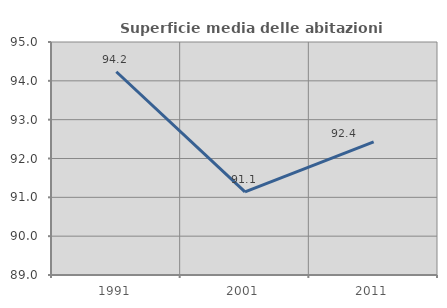
| Category | Superficie media delle abitazioni occupate |
|---|---|
| 1991.0 | 94.234 |
| 2001.0 | 91.142 |
| 2011.0 | 92.426 |